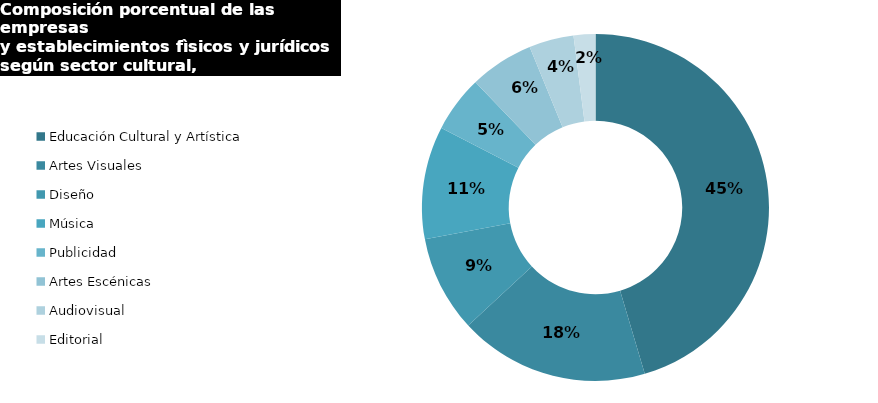
| Category | Series 0 |
|---|---|
| Educación Cultural y Artística | 5560 |
| Artes Visuales | 2165 |
| Diseño | 1098 |
| Música | 1287 |
| Publicidad | 643 |
| Artes Escénicas | 731 |
| Audiovisual | 510 |
| Editorial | 248 |